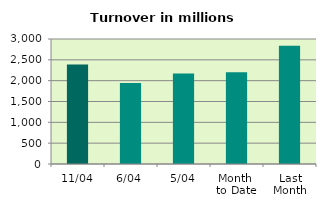
| Category | Series 0 |
|---|---|
| 11/04 | 2389.526 |
| 6/04 | 1942.397 |
| 5/04 | 2170.67 |
| Month 
to Date | 2204.632 |
| Last
Month | 2840.905 |